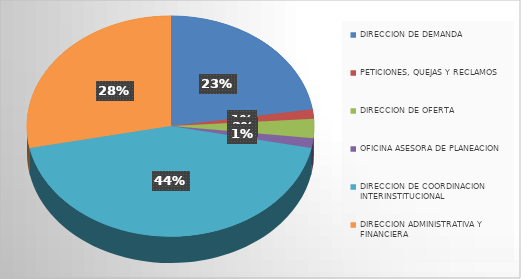
| Category | Series 0 |
|---|---|
| DIRECCION DE DEMANDA | 16 |
| PETICIONES, QUEJAS Y RECLAMOS | 1 |
| DIRECCION DE OFERTA | 2 |
| OFICINA ASESORA DE PLANEACION | 1 |
| DIRECCION DE COORDINACION INTERINSTITUCIONAL | 31 |
| DIRECCION ADMINISTRATIVA Y FINANCIERA | 20 |